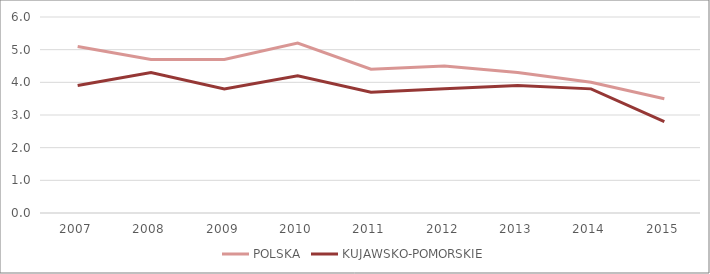
| Category | POLSKA | KUJAWSKO-POMORSKIE |
|---|---|---|
| 2007 | 5.1 | 3.9 |
| 2008 | 4.7 | 4.3 |
| 2009 | 4.7 | 3.8 |
| 2010 | 5.2 | 4.2 |
| 2011 | 4.4 | 3.7 |
| 2012 | 4.5 | 3.8 |
| 2013 | 4.3 | 3.9 |
| 2014 | 4 | 3.8 |
| 2015 | 3.5 | 2.8 |